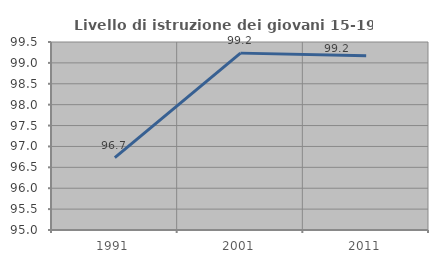
| Category | Livello di istruzione dei giovani 15-19 anni |
|---|---|
| 1991.0 | 96.73 |
| 2001.0 | 99.234 |
| 2011.0 | 99.174 |